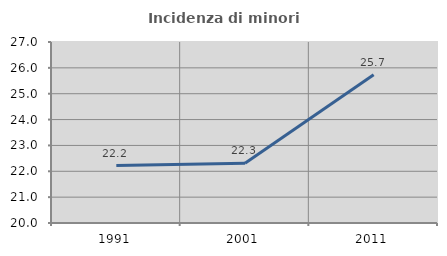
| Category | Incidenza di minori stranieri |
|---|---|
| 1991.0 | 22.222 |
| 2001.0 | 22.314 |
| 2011.0 | 25.731 |